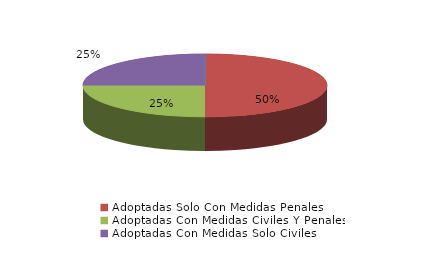
| Category | Series 0 |
|---|---|
| Denegadas | 0 |
| Adoptadas Solo Con Medidas Penales | 4 |
| Adoptadas Con Medidas Civiles Y Penales | 2 |
| Adoptadas Con Medidas Solo Civiles | 2 |